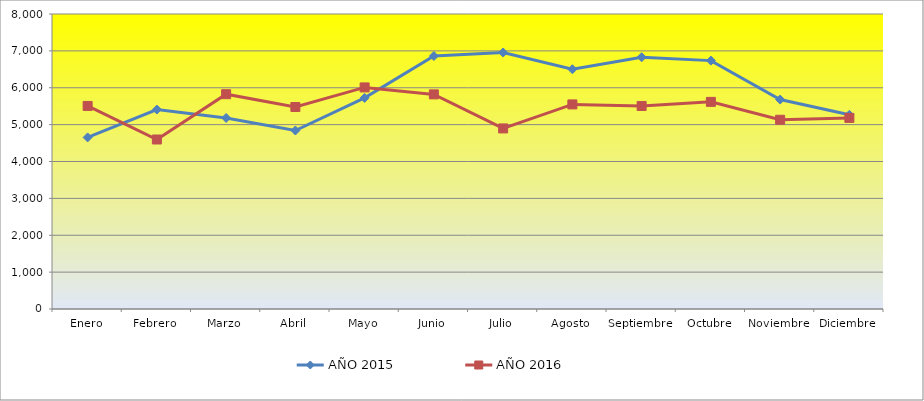
| Category | AÑO 2015 | AÑO 2016 |
|---|---|---|
| Enero | 4653 | 5507 |
| Febrero | 5409 | 4597 |
| Marzo | 5181 | 5825 |
| Abril | 4840 | 5478 |
| Mayo | 5725 | 6009 |
| Junio | 6861 | 5820 |
| Julio | 6956 | 4897 |
| Agosto | 6502 | 5548 |
| Septiembre | 6828 | 5506 |
| Octubre | 6736 | 5617 |
| Noviembre | 5680 | 5132 |
| Diciembre | 5266 | 5183 |